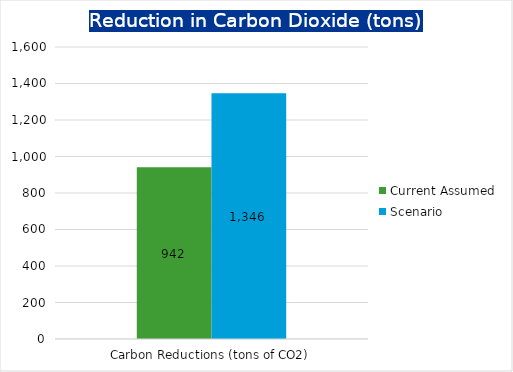
| Category | Current Assumed | Scenario |
|---|---|---|
| Carbon Reductions (tons of CO2) | 941.64 | 1346.035 |